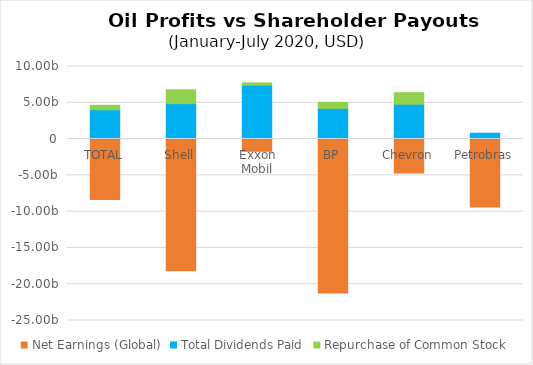
| Category | Net Earnings (Global) | Total Dividends Paid | Repurchase of Common Stock |
|---|---|---|---|
| TOTAL | -8335000000 | 4041000000 | 611000000 |
| Shell | -18155000000 | 4880000000 | 1901000000 |
| Exxon Mobil | -1690000000 | 7434000000 | 305000000 |
| BP | -21213000000 | 4221000000 | 824000000 |
| Chevron | -4671000000 | 4800000000 | 1600000000 |
| Petrobras | -9350317560.228 | 807723193.098 | 0 |